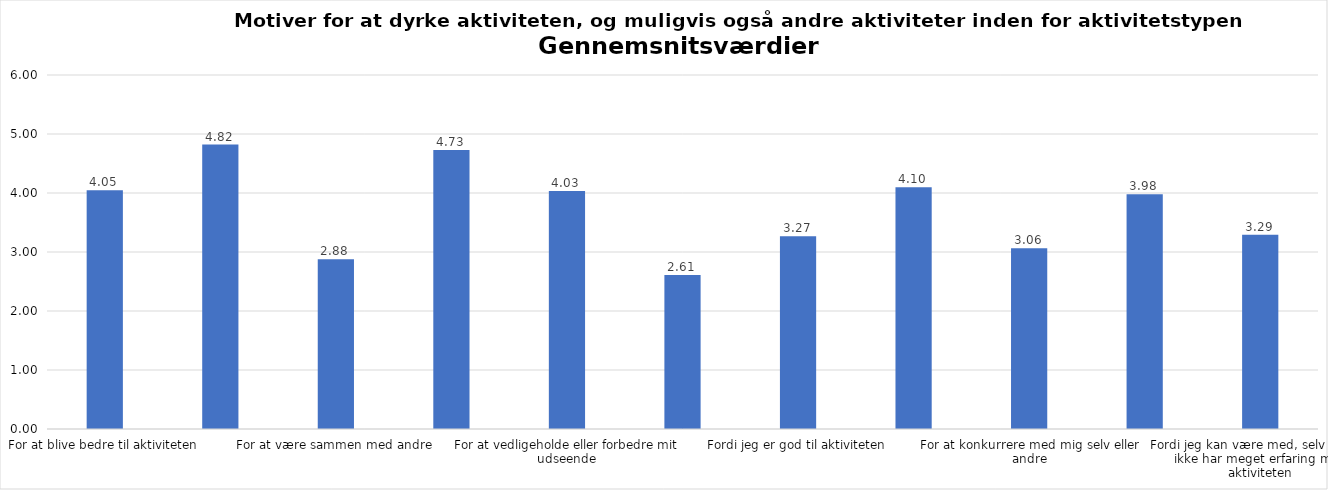
| Category | Gennemsnit |
|---|---|
| For at blive bedre til aktiviteten | 4.048 |
| For at vedligeholde eller forbedre min sundhed (fx helbred, fysisk form) | 4.82 |
| For at være sammen med andre | 2.878 |
| For at gøre noget godt for mig selv | 4.729 |
| For at vedligeholde eller forbedre mit udseende | 4.034 |
| Fordi andre i min omgangskreds opmuntrer mig til det | 2.611 |
| Fordi jeg er god til aktiviteten | 3.267 |
| Fordi jeg godt kan lide aktiviteten | 4.099 |
| For at konkurrere med mig selv eller andre | 3.063 |
| Fordi aktiviteten passer godt ind i min hverdag | 3.98 |
| Fordi jeg kan være med, selv om jeg ikke har meget erfaring med aktiviteten | 3.29 |